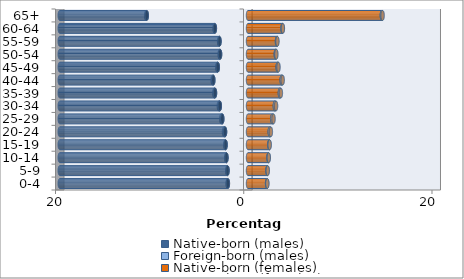
| Category | Native-born (males) | Foreign-born (males) | Native-born (females) | Foreign-born (females) |
|---|---|---|---|---|
| 0-4 | -2.136 | -0.03 | 2.026 | 0.029 |
| 5-9 | -2.174 | -0.027 | 2.066 | 0.026 |
| 10-14 | -2.286 | -0.028 | 2.176 | 0.028 |
| 15-19 | -2.377 | -0.039 | 2.26 | 0.042 |
| 20-24 | -2.438 | -0.112 | 2.306 | 0.124 |
| 25-29 | -2.73 | -0.116 | 2.579 | 0.135 |
| 30-34 | -2.993 | -0.104 | 2.852 | 0.129 |
| 35-39 | -3.505 | -0.08 | 3.384 | 0.11 |
| 40-44 | -3.683 | -0.075 | 3.578 | 0.109 |
| 45-49 | -3.207 | -0.061 | 3.15 | 0.089 |
| 50-54 | -2.966 | -0.047 | 2.95 | 0.064 |
| 55-59 | -3.027 | -0.04 | 3.078 | 0.05 |
| 60-64 | -3.519 | -0.033 | 3.666 | 0.04 |
| 65+ | -10.754 | -0.068 | 14.219 | 0.084 |